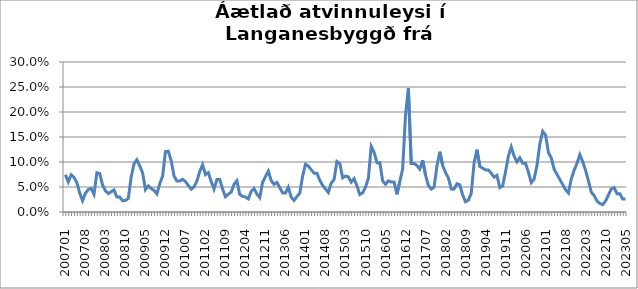
| Category | Series 0 |
|---|---|
| 200701 | 0.074 |
| 200702 | 0.06 |
| 200703 | 0.074 |
| 200704 | 0.069 |
| 200705 | 0.059 |
| 200706 | 0.038 |
| 200707 | 0.023 |
| 200708 | 0.038 |
| 200709 | 0.045 |
| 200710 | 0.047 |
| 200711 | 0.035 |
| 200712 | 0.078 |
| 200801 | 0.077 |
| 200802 | 0.054 |
| 200803 | 0.042 |
| 200804 | 0.037 |
| 200805 | 0.04 |
| 200806 | 0.044 |
| 200807 | 0.03 |
| 200808 | 0.03 |
| 200809 | 0.022 |
| 200810 | 0.023 |
| 200811 | 0.027 |
| 200812 | 0.069 |
| 200901 | 0.096 |
| 200902 | 0.104 |
| 200903 | 0.092 |
| 200904 | 0.078 |
| 200905 | 0.045 |
| 200906 | 0.052 |
| 200907 | 0.047 |
| 200908 | 0.043 |
| 200909 | 0.036 |
| 200910 | 0.057 |
| 200911 | 0.072 |
| 200912 | 0.121 |
| 201001 | 0.122 |
| 201002 | 0.103 |
| 201003 | 0.072 |
| 201004 | 0.062 |
| 201005 | 0.062 |
| 201006 | 0.065 |
| 201007 | 0.061 |
| 201008 | 0.053 |
| 201009 | 0.046 |
| 201010 | 0.05 |
| 201011 | 0.062 |
| 201012 | 0.081 |
| 201101 | 0.094 |
| 201102 | 0.075 |
| 201103 | 0.079 |
| 201104 | 0.061 |
| 201105 | 0.046 |
| 201106 | 0.065 |
| 201107 | 0.065 |
| 201108 | 0.046 |
| 201109 | 0.031 |
| 201110 | 0.036 |
| 201111 | 0.04 |
| 201112 | 0.056 |
| 201201 | 0.062 |
| 201202 | 0.035 |
| 201203 | 0.031 |
| 201204 | 0.03 |
| 201205 | 0.026 |
| 201206 | 0.041 |
| 201207 | 0.047 |
| 201208 | 0.036 |
| 201209 | 0.029 |
| 201210 | 0.059 |
| 201211 | 0.071 |
| 201212 | 0.082 |
| 201301 | 0.063 |
| 201302 | 0.055 |
| 201303 | 0.059 |
| 201304 | 0.049 |
| 201305 | 0.038 |
| 201306 | 0.038 |
| 201307 | 0.05 |
| 201308 | 0.03 |
| 201309 | 0.023 |
| 201310 | 0.031 |
| 201311 | 0.038 |
| 201312 | 0.072 |
| 201401 | 0.096 |
| 201402 | 0.092 |
| 201403 | 0.085 |
| 201404 | 0.078 |
| 201405 | 0.078 |
| 201406 | 0.064 |
| 201407 | 0.053 |
| 201408 | 0.046 |
| 201409 | 0.039 |
| 201410 | 0.058 |
| 201411 | 0.065 |
| 201412 | 0.101 |
| 201501 | 0.097 |
| 201502 | 0.068 |
| 201503 | 0.072 |
| 201504 | 0.07 |
| 201505 | 0.06 |
| 201506 | 0.067 |
| 201507 | 0.052 |
| 201508 | 0.035 |
| 201509 | 0.038 |
| 201510 | 0.05 |
| 201511 | 0.067 |
| 201512 | 0.131 |
| 201601 | 0.12 |
| 201602 | 0.099 |
| 201603 | 0.099 |
| 201604 | 0.062 |
| 201605 | 0.055 |
| 201606 | 0.062 |
| 201607 | 0.06 |
| 201608 | 0.06 |
| 201609 | 0.035 |
| 201610 | 0.061 |
| 201611 | 0.086 |
| 201612 | 0.194 |
| 201701 | 0.247 |
| 201702 | 0.097 |
| 201703 | 0.097 |
| 201704 | 0.093 |
| 201705 | 0.086 |
| 201706 | 0.104 |
| 201707 | 0.074 |
| 201708 | 0.053 |
| 201709 | 0.046 |
| 201710 | 0.05 |
| 201711 | 0.092 |
| 201712 | 0.121 |
| 201801 | 0.093 |
| 201802 | 0.079 |
| 201803 | 0.068 |
| 201804 | 0.046 |
| 201805 | 0.046 |
| 201806 | 0.057 |
| 201807 | 0.054 |
| 201808 | 0.034 |
| 201809 | 0.02 |
| 201810 | 0.024 |
| 201811 | 0.037 |
| 201812 | 0.098 |
| 201901 | 0.125 |
| 201902 | 0.091 |
| 201903 | 0.088 |
| 201904 | 0.084 |
| 201905 | 0.084 |
| 201906 | 0.077 |
| 201907 | 0.07 |
| 201908 | 0.073 |
| 201909 | 0.049 |
| 201910 | 0.052 |
| 201911 | 0.08 |
| 201912 | 0.112 |
| 202001 | 0.13 |
| 202002 | 0.112 |
| 202003 | 0.1 |
| 202004 | 0.109 |
| 202005 | 0.097 |
| 202006 | 0.097 |
| 202007 | 0.08 |
| 202008 | 0.059 |
| 202009 | 0.066 |
| 202010 | 0.093 |
| 202011 | 0.136 |
| 202012 | 0.161 |
| 202101 | 0.154 |
| 202102 | 0.119 |
| 202103 | 0.108 |
| 202104 | 0.086 |
| 202105 | 0.075 |
| 202106 | 0.065 |
| 202107 | 0.055 |
| 202108 | 0.045 |
| 202109 | 0.038 |
| 202110 | 0.066 |
| 202111 | 0.083 |
| 202112 | 0.097 |
| 202201 | 0.115 |
| 202202 | 0.101 |
| 202203 | 0.083 |
| 202204 | 0.062 |
| 202205 | 0.039 |
| 202206 | 0.033 |
| 202207 | 0.022 |
| 202208 | 0.017 |
| 202209 | 0.015 |
| 202210 | 0.022 |
| 202211 | 0.034 |
| 202212 | 0.046 |
| 202301 | 0.049 |
| 202302 | 0.036 |
| 202303 | 0.036 |
| 202304 | 0.026 |
| 202305 | 0.026 |